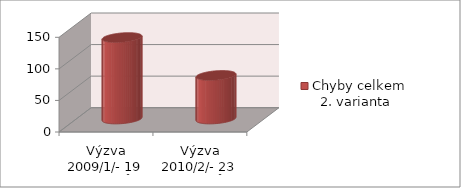
| Category | Chyby celkem              2. varianta |
|---|---|
| Výzva 2009/1/- 19 projektů | 129 |
| Výzva 2010/2/- 23 projektů  | 69 |